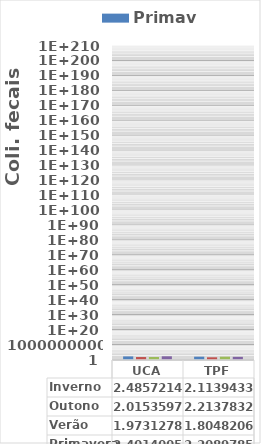
| Category | Primavera | Verão | Outono | Inverno |
|---|---|---|---|---|
| UCA | 252 | 94 | 103.6 | 306 |
| TPF | 161.8 | 63.8 | 163.6 | 130 |